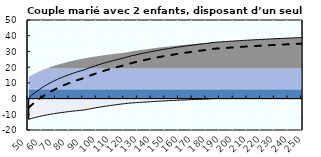
| Category | Coin fiscal moyen (somme des composantes) | Taux moyen d'imposition net en % du salaire brut |
|---|---|---|
| 50.0 | 0.462 | -5.859 |
| 51.0 | 1.241 | -5.03 |
| 52.0 | 1.991 | -4.233 |
| 53.0 | 2.712 | -3.465 |
| 54.0 | 3.407 | -2.727 |
| 55.0 | 4.077 | -2.015 |
| 56.0 | 4.722 | -1.328 |
| 57.0 | 5.345 | -0.666 |
| 58.0 | 5.946 | -0.026 |
| 59.0 | 6.528 | 0.592 |
| 60.0 | 7.089 | 1.189 |
| 61.0 | 7.632 | 1.767 |
| 62.0 | 8.158 | 2.326 |
| 63.0 | 8.667 | 2.868 |
| 64.0 | 9.16 | 3.392 |
| 65.0 | 9.638 | 3.9 |
| 66.0 | 10.102 | 4.393 |
| 67.0 | 10.551 | 4.871 |
| 68.0 | 10.988 | 5.336 |
| 69.0 | 11.412 | 5.786 |
| 70.0 | 11.823 | 6.224 |
| 71.0 | 12.223 | 6.649 |
| 72.0 | 12.612 | 7.063 |
| 73.0 | 12.991 | 7.465 |
| 74.0 | 13.359 | 7.857 |
| 75.0 | 13.717 | 8.238 |
| 76.0 | 14.066 | 8.609 |
| 77.0 | 14.405 | 8.97 |
| 78.0 | 14.736 | 9.322 |
| 79.0 | 15.059 | 9.665 |
| 80.0 | 15.374 | 10 |
| 81.0 | 15.681 | 10.326 |
| 82.0 | 15.98 | 10.645 |
| 83.0 | 16.272 | 10.955 |
| 84.0 | 16.557 | 11.259 |
| 85.0 | 16.836 | 11.555 |
| 86.0 | 17.108 | 11.844 |
| 87.0 | 17.374 | 12.127 |
| 88.0 | 17.633 | 12.403 |
| 89.0 | 17.887 | 12.673 |
| 90.0 | 18.135 | 12.937 |
| 91.0 | 18.448 | 13.27 |
| 92.0 | 18.783 | 13.626 |
| 93.0 | 19.111 | 13.974 |
| 94.0 | 19.431 | 14.315 |
| 95.0 | 19.745 | 14.649 |
| 96.0 | 20.053 | 14.976 |
| 97.0 | 20.354 | 15.296 |
| 98.0 | 20.649 | 15.61 |
| 99.0 | 20.938 | 15.917 |
| 100.0 | 21.221 | 16.218 |
| 101.0 | 21.498 | 16.513 |
| 102.0 | 21.77 | 16.803 |
| 103.0 | 22.037 | 17.087 |
| 104.0 | 22.299 | 17.365 |
| 105.0 | 22.556 | 17.638 |
| 106.0 | 22.808 | 17.906 |
| 107.0 | 23.055 | 18.169 |
| 108.0 | 23.297 | 18.427 |
| 109.0 | 23.535 | 18.68 |
| 110.0 | 23.769 | 18.929 |
| 111.0 | 23.999 | 19.173 |
| 112.0 | 24.224 | 19.413 |
| 113.0 | 24.446 | 19.648 |
| 114.0 | 24.663 | 19.88 |
| 115.0 | 24.877 | 20.107 |
| 116.0 | 25.087 | 20.33 |
| 117.0 | 25.294 | 20.55 |
| 118.0 | 25.497 | 20.766 |
| 119.0 | 25.72 | 21.003 |
| 120.0 | 25.979 | 21.278 |
| 121.0 | 26.233 | 21.549 |
| 122.0 | 26.483 | 21.815 |
| 123.0 | 26.729 | 22.076 |
| 124.0 | 26.944 | 22.305 |
| 125.0 | 27.154 | 22.528 |
| 126.0 | 27.36 | 22.748 |
| 127.0 | 27.563 | 22.963 |
| 128.0 | 27.763 | 23.176 |
| 129.0 | 27.96 | 23.385 |
| 130.0 | 28.153 | 23.591 |
| 131.0 | 28.344 | 23.794 |
| 132.0 | 28.532 | 23.994 |
| 133.0 | 28.717 | 24.19 |
| 134.0 | 28.899 | 24.384 |
| 135.0 | 29.079 | 24.575 |
| 136.0 | 29.255 | 24.763 |
| 137.0 | 29.43 | 24.949 |
| 138.0 | 29.602 | 25.131 |
| 139.0 | 29.771 | 25.311 |
| 140.0 | 29.938 | 25.489 |
| 141.0 | 30.102 | 25.664 |
| 142.0 | 30.264 | 25.836 |
| 143.0 | 30.424 | 26.006 |
| 144.0 | 30.582 | 26.174 |
| 145.0 | 30.738 | 26.34 |
| 146.0 | 30.891 | 26.503 |
| 147.0 | 31.042 | 26.664 |
| 148.0 | 31.192 | 26.822 |
| 149.0 | 31.339 | 26.979 |
| 150.0 | 31.484 | 27.134 |
| 151.0 | 31.628 | 27.286 |
| 152.0 | 31.769 | 27.437 |
| 153.0 | 31.909 | 27.585 |
| 154.0 | 32.047 | 27.732 |
| 155.0 | 32.183 | 27.876 |
| 156.0 | 32.317 | 28.019 |
| 157.0 | 32.45 | 28.16 |
| 158.0 | 32.581 | 28.299 |
| 159.0 | 32.71 | 28.437 |
| 160.0 | 32.837 | 28.573 |
| 161.0 | 32.964 | 28.707 |
| 162.0 | 33.088 | 28.839 |
| 163.0 | 33.211 | 28.97 |
| 164.0 | 33.333 | 29.099 |
| 165.0 | 33.453 | 29.227 |
| 166.0 | 33.571 | 29.353 |
| 167.0 | 33.688 | 29.478 |
| 168.0 | 33.804 | 29.601 |
| 169.0 | 33.918 | 29.722 |
| 170.0 | 34.032 | 29.843 |
| 171.0 | 34.143 | 29.961 |
| 172.0 | 34.254 | 30.079 |
| 173.0 | 34.363 | 30.195 |
| 174.0 | 34.471 | 30.31 |
| 175.0 | 34.577 | 30.423 |
| 176.0 | 34.683 | 30.535 |
| 177.0 | 34.787 | 30.646 |
| 178.0 | 34.89 | 30.756 |
| 179.0 | 34.992 | 30.864 |
| 180.0 | 35.093 | 30.971 |
| 181.0 | 35.193 | 31.077 |
| 182.0 | 35.291 | 31.182 |
| 183.0 | 35.389 | 31.286 |
| 184.0 | 35.664 | 31.579 |
| 185.0 | 35.73 | 31.648 |
| 186.0 | 35.794 | 31.717 |
| 187.0 | 35.858 | 31.785 |
| 188.0 | 35.921 | 31.852 |
| 189.0 | 35.983 | 31.918 |
| 190.0 | 36.045 | 31.984 |
| 191.0 | 36.106 | 32.049 |
| 192.0 | 36.167 | 32.113 |
| 193.0 | 36.227 | 32.177 |
| 194.0 | 36.286 | 32.24 |
| 195.0 | 36.344 | 32.302 |
| 196.0 | 36.403 | 32.364 |
| 197.0 | 36.46 | 32.425 |
| 198.0 | 36.517 | 32.486 |
| 199.0 | 36.573 | 32.546 |
| 200.0 | 36.629 | 32.605 |
| 201.0 | 36.684 | 32.663 |
| 202.0 | 36.739 | 32.722 |
| 203.0 | 36.793 | 32.779 |
| 204.0 | 36.846 | 32.836 |
| 205.0 | 36.899 | 32.892 |
| 206.0 | 36.952 | 32.948 |
| 207.0 | 37.004 | 33.004 |
| 208.0 | 37.055 | 33.058 |
| 209.0 | 37.106 | 33.113 |
| 210.0 | 37.157 | 33.166 |
| 211.0 | 37.207 | 33.22 |
| 212.0 | 37.257 | 33.272 |
| 213.0 | 37.306 | 33.325 |
| 214.0 | 37.354 | 33.376 |
| 215.0 | 37.403 | 33.428 |
| 216.0 | 37.45 | 33.479 |
| 217.0 | 37.498 | 33.529 |
| 218.0 | 37.545 | 33.579 |
| 219.0 | 37.591 | 33.628 |
| 220.0 | 37.637 | 33.677 |
| 221.0 | 37.683 | 33.726 |
| 222.0 | 37.728 | 33.774 |
| 223.0 | 37.773 | 33.821 |
| 224.0 | 37.817 | 33.869 |
| 225.0 | 37.861 | 33.915 |
| 226.0 | 37.905 | 33.962 |
| 227.0 | 37.948 | 34.008 |
| 228.0 | 37.991 | 34.053 |
| 229.0 | 38.033 | 34.098 |
| 230.0 | 38.075 | 34.143 |
| 231.0 | 38.117 | 34.188 |
| 232.0 | 38.159 | 34.232 |
| 233.0 | 38.2 | 34.275 |
| 234.0 | 38.24 | 34.319 |
| 235.0 | 38.281 | 34.362 |
| 236.0 | 38.321 | 34.404 |
| 237.0 | 38.36 | 34.446 |
| 238.0 | 38.4 | 34.488 |
| 239.0 | 38.439 | 34.53 |
| 240.0 | 38.477 | 34.571 |
| 241.0 | 38.516 | 34.611 |
| 242.0 | 38.554 | 34.652 |
| 243.0 | 38.591 | 34.692 |
| 244.0 | 38.629 | 34.732 |
| 245.0 | 38.666 | 34.771 |
| 246.0 | 38.703 | 34.81 |
| 247.0 | 38.739 | 34.849 |
| 248.0 | 38.775 | 34.888 |
| 249.0 | 38.811 | 34.926 |
| 250.0 | 38.847 | 34.964 |